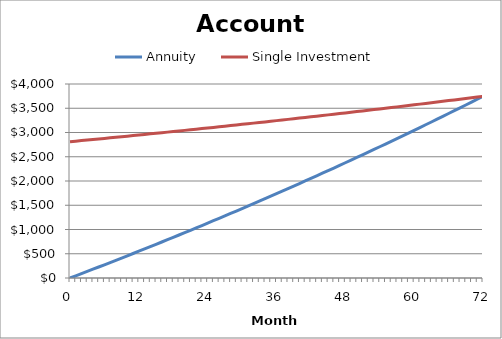
| Category | Annuity | Single Investment |
|---|---|---|
| 0.0 | 0 | 2810.335 |
| 1.0 | 45 | 2821.575 |
| 2.0 | 90.18 | 2832.865 |
| 3.0 | 135.54 | 2844.195 |
| 4.0 | 181.08 | 2855.575 |
| 5.0 | 226.8 | 2866.995 |
| 6.0 | 272.71 | 2878.465 |
| 7.0 | 318.8 | 2889.975 |
| 8.0 | 365.08 | 2901.535 |
| 9.0 | 411.54 | 2913.145 |
| 10.0 | 458.19 | 2924.795 |
| 11.0 | 505.02 | 2936.495 |
| 12.0 | 552.04 | 2948.245 |
| 13.0 | 599.25 | 2960.035 |
| 14.0 | 646.65 | 2971.875 |
| 15.0 | 694.24 | 2983.765 |
| 16.0 | 742.02 | 2995.705 |
| 17.0 | 789.99 | 3007.685 |
| 18.0 | 838.15 | 3019.715 |
| 19.0 | 886.5 | 3031.795 |
| 20.0 | 935.05 | 3043.925 |
| 21.0 | 983.79 | 3056.105 |
| 22.0 | 1032.73 | 3068.325 |
| 23.0 | 1081.86 | 3080.595 |
| 24.0 | 1131.19 | 3092.915 |
| 25.0 | 1180.71 | 3105.285 |
| 26.0 | 1230.43 | 3117.705 |
| 27.0 | 1280.35 | 3130.175 |
| 28.0 | 1330.47 | 3142.695 |
| 29.0 | 1380.79 | 3155.265 |
| 30.0 | 1431.31 | 3167.885 |
| 31.0 | 1482.04 | 3180.555 |
| 32.0 | 1532.97 | 3193.275 |
| 33.0 | 1584.1 | 3206.045 |
| 34.0 | 1635.44 | 3218.865 |
| 35.0 | 1686.98 | 3231.745 |
| 36.0 | 1738.73 | 3244.675 |
| 37.0 | 1790.68 | 3257.655 |
| 38.0 | 1842.84 | 3270.685 |
| 39.0 | 1895.21 | 3283.765 |
| 40.0 | 1947.79 | 3296.905 |
| 41.0 | 2000.58 | 3310.095 |
| 42.0 | 2053.58 | 3323.335 |
| 43.0 | 2106.79 | 3336.625 |
| 44.0 | 2160.22 | 3349.975 |
| 45.0 | 2213.86 | 3363.375 |
| 46.0 | 2267.72 | 3376.825 |
| 47.0 | 2321.79 | 3390.335 |
| 48.0 | 2376.08 | 3403.895 |
| 49.0 | 2430.58 | 3417.515 |
| 50.0 | 2485.3 | 3431.185 |
| 51.0 | 2540.24 | 3444.905 |
| 52.0 | 2595.4 | 3458.685 |
| 53.0 | 2650.78 | 3472.515 |
| 54.0 | 2706.38 | 3486.405 |
| 55.0 | 2762.21 | 3500.355 |
| 56.0 | 2818.26 | 3514.355 |
| 57.0 | 2874.53 | 3528.415 |
| 58.0 | 2931.03 | 3542.525 |
| 59.0 | 2987.75 | 3556.695 |
| 60.0 | 3044.7 | 3570.925 |
| 61.0 | 3101.88 | 3585.205 |
| 62.0 | 3159.29 | 3599.545 |
| 63.0 | 3216.93 | 3613.945 |
| 64.0 | 3274.8 | 3628.405 |
| 65.0 | 3332.9 | 3642.915 |
| 66.0 | 3391.23 | 3657.485 |
| 67.0 | 3449.79 | 3672.115 |
| 68.0 | 3508.59 | 3686.805 |
| 69.0 | 3567.62 | 3701.555 |
| 70.0 | 3626.89 | 3716.365 |
| 71.0 | 3686.4 | 3731.235 |
| 72.0 | 3746.15 | 3746.155 |